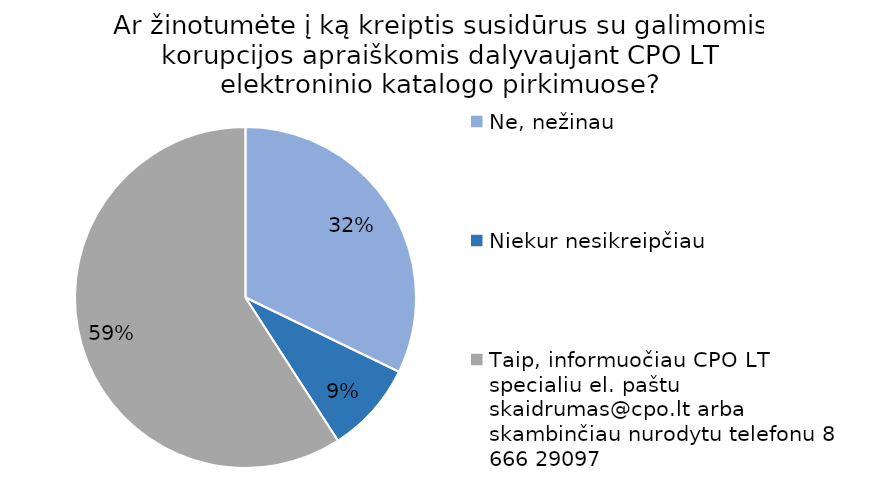
| Category | Series 0 |
|---|---|
| Ne, nežinau | 37 |
| Niekur nesikreipčiau | 10 |
| Taip, informuočiau CPO LT specialiu el. paštu skaidrumas@cpo.lt arba skambinčiau nurodytu telefonu 8 666 29097 | 68 |